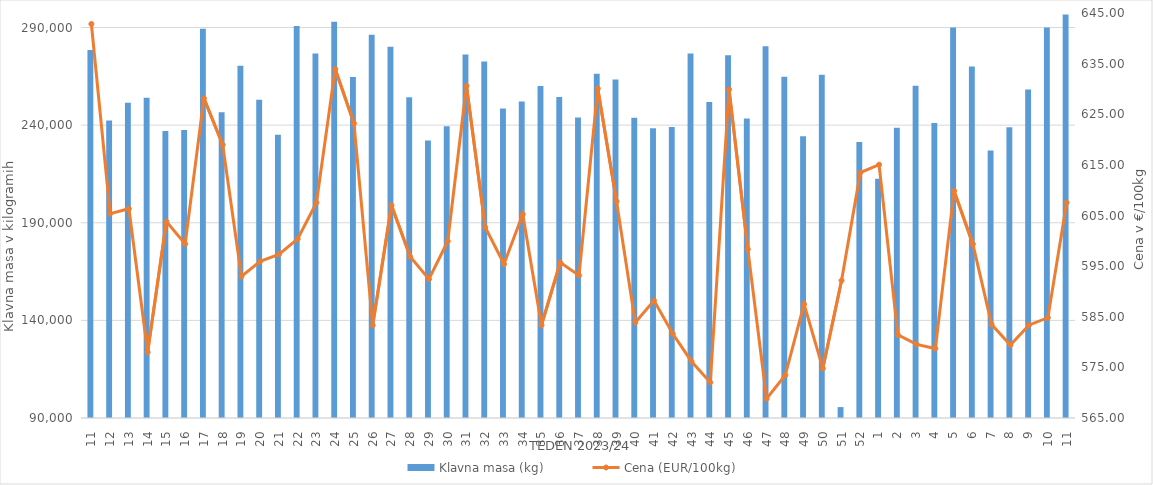
| Category | Klavna masa (kg) |
|---|---|
| 11.0 | 278467 |
| 12.0 | 242369 |
| 13.0 | 251507 |
| 14.0 | 254072 |
| 15.0 | 236964 |
| 16.0 | 237552 |
| 17.0 | 289400 |
| 18.0 | 246616 |
| 19.0 | 270374 |
| 20.0 | 252984 |
| 21.0 | 235060 |
| 22.0 | 290816 |
| 23.0 | 276702 |
| 24.0 | 292976 |
| 25.0 | 264669 |
| 26.0 | 286237 |
| 27.0 | 280112 |
| 28.0 | 254336 |
| 29.0 | 232178 |
| 30.0 | 239437 |
| 31.0 | 276163 |
| 32.0 | 272647 |
| 33.0 | 248536 |
| 34.0 | 252050 |
| 35.0 | 260110 |
| 36.0 | 254389 |
| 37.0 | 243933 |
| 38.0 | 266321 |
| 39.0 | 263346 |
| 40.0 | 243765 |
| 41.0 | 238404 |
| 42.0 | 239007 |
| 43.0 | 276684 |
| 44.0 | 251832 |
| 45.0 | 275816 |
| 46.0 | 243425 |
| 47.0 | 280350 |
| 48.0 | 264849 |
| 49.0 | 234308 |
| 50.0 | 265786 |
| 51.0 | 95590 |
| 52.0 | 231370 |
| 1.0 | 212581 |
| 2.0 | 238607 |
| 3.0 | 260140 |
| 4.0 | 241148 |
| 5.0 | 290049 |
| 6.0 | 270025 |
| 7.0 | 227057 |
| 8.0 | 238927 |
| 9.0 | 258215 |
| 10.0 | 290025 |
| 11.0 | 296713 |